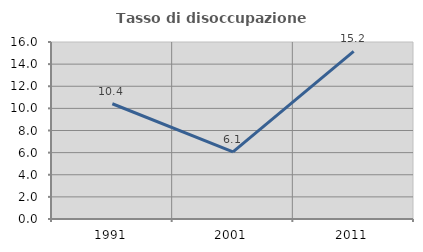
| Category | Tasso di disoccupazione giovanile  |
|---|---|
| 1991.0 | 10.417 |
| 2001.0 | 6.061 |
| 2011.0 | 15.152 |